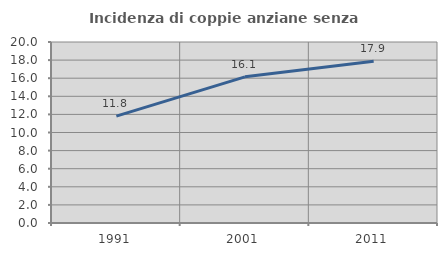
| Category | Incidenza di coppie anziane senza figli  |
|---|---|
| 1991.0 | 11.806 |
| 2001.0 | 16.149 |
| 2011.0 | 17.881 |